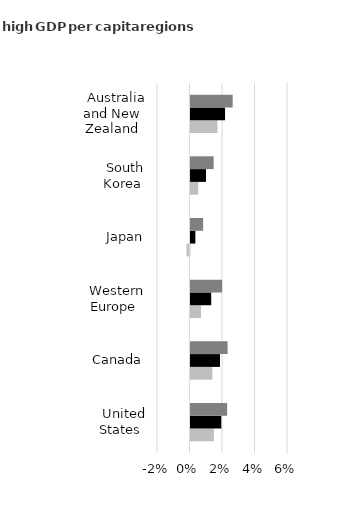
| Category | Low Economic Growth case | Reference case | High Economic Growth case |
|---|---|---|---|
|   United States | 1.438 | 1.895 | 2.254 |
|   Canada | 1.349 | 1.817 | 2.285 |
|   Western Europe | 0.645 | 1.275 | 1.945 |
|   Japan | -0.182 | 0.3 | 0.777 |
|   South Korea | 0.474 | 0.955 | 1.426 |
|   Australia and New Zealand | 1.658 | 2.126 | 2.596 |